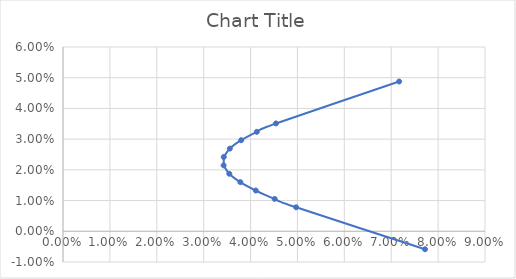
| Category | Series 0 |
|---|---|
| 0.07169213607575096 | 0.049 |
| 0.04540988034094193 | 0.035 |
| 0.04134204844706092 | 0.032 |
| 0.03799766171219985 | 0.03 |
| 0.035581304219570176 | 0.027 |
| 0.03428973188742665 | 0.024 |
| 0.03425042779926674 | 0.021 |
| 0.0354675553785307 | 0.019 |
| 0.03782000466949571 | 0.016 |
| 0.041113350756748004 | 0.013 |
| 0.0451421317204813 | 0.011 |
| 0.04972792063485416 | 0.008 |
| 0.07720997404014182 | -0.006 |